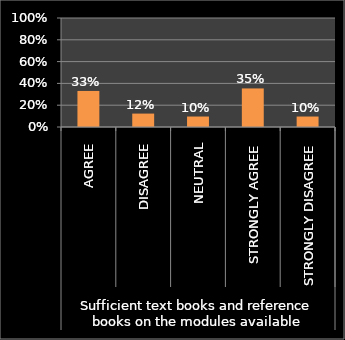
| Category | Series 0 |
|---|---|
| 0 | 0.331 |
| 1 | 0.123 |
| 2 | 0.096 |
| 3 | 0.354 |
| 4 | 0.096 |